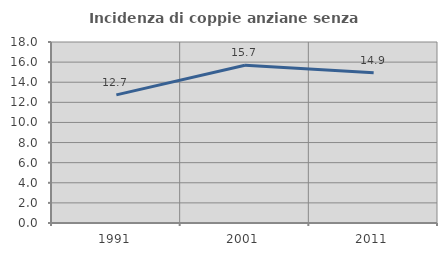
| Category | Incidenza di coppie anziane senza figli  |
|---|---|
| 1991.0 | 12.745 |
| 2001.0 | 15.695 |
| 2011.0 | 14.938 |